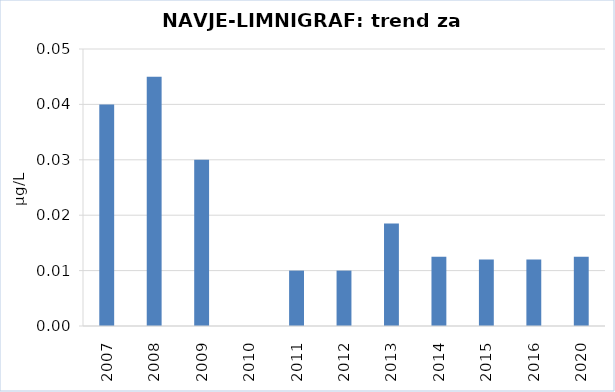
| Category | Vsota |
|---|---|
| 2007 | 0.04 |
| 2008 | 0.045 |
| 2009 | 0.03 |
| 2010 | 0 |
| 2011 | 0.01 |
| 2012 | 0.01 |
| 2013 | 0.018 |
| 2014 | 0.012 |
| 2015 | 0.012 |
| 2016 | 0.012 |
| 2020 | 0.012 |